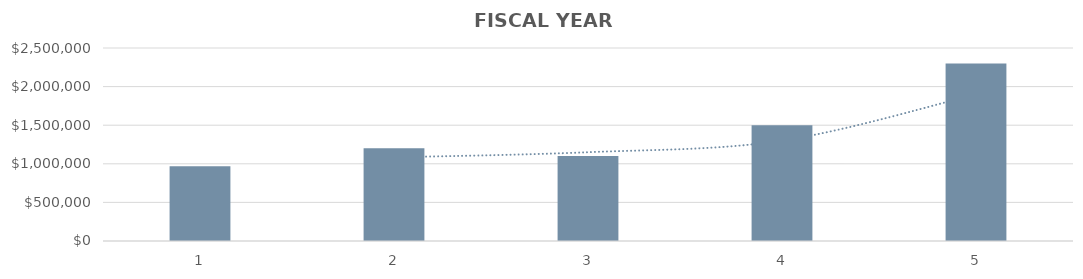
| Category | Series 0 |
|---|---|
| 1.0 | 968000 |
| 2.0 | 1200000 |
| 3.0 | 1100000 |
| 4.0 | 1500000 |
| 5.0 | 2300000 |